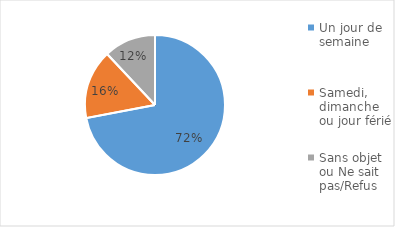
| Category | Series 0 |
|---|---|
| Un jour de semaine | 0.72 |
| Samedi, dimanche ou jour férié | 0.16 |
| Sans objet ou Ne sait pas/Refus | 0.12 |